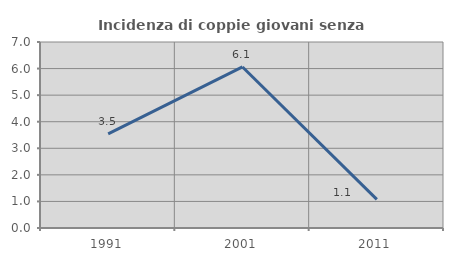
| Category | Incidenza di coppie giovani senza figli |
|---|---|
| 1991.0 | 3.54 |
| 2001.0 | 6.061 |
| 2011.0 | 1.075 |